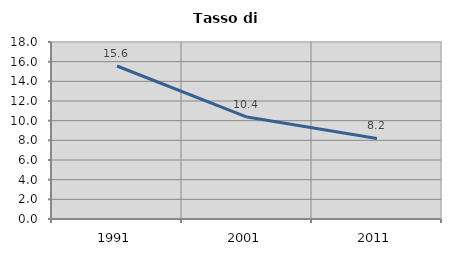
| Category | Tasso di disoccupazione   |
|---|---|
| 1991.0 | 15.56 |
| 2001.0 | 10.37 |
| 2011.0 | 8.194 |